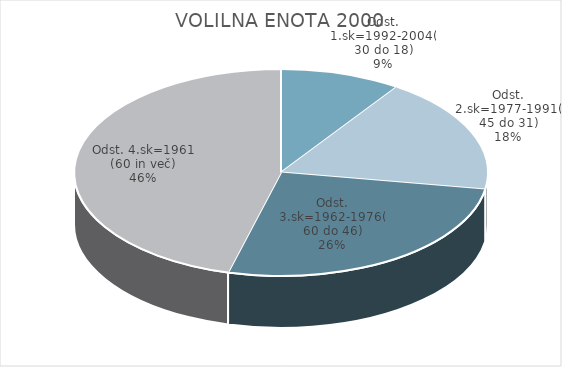
| Category | VOLILNA ENOTA 2000 |
|---|---|
| Odst. 1.sk=1992-2004(30 do 18) | 4.65 |
| Odst. 2.sk=1977-1991(45 do 31) | 8.91 |
| Odst. 3.sk=1962-1976(60 do 46) | 13.01 |
| Odst. 4.sk=1961 (60 in več) | 22.53 |